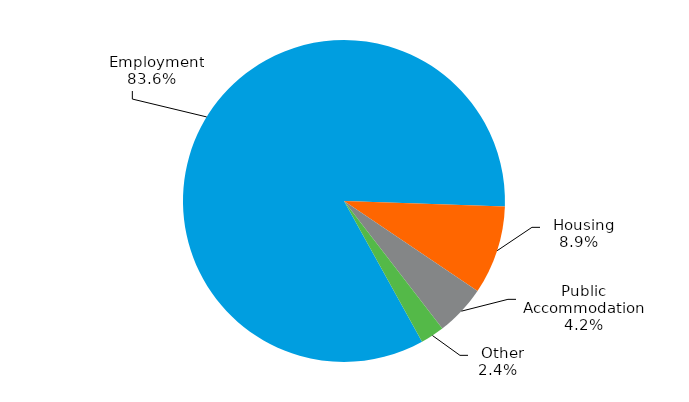
| Category | Series 0 |
|---|---|
|   Employment | 0.836 |
|   Housing | 0.089 |
|   Public Accommodation | 0.051 |
|   Other | 0.024 |